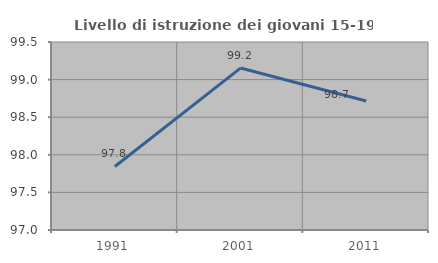
| Category | Livello di istruzione dei giovani 15-19 anni |
|---|---|
| 1991.0 | 97.845 |
| 2001.0 | 99.153 |
| 2011.0 | 98.715 |